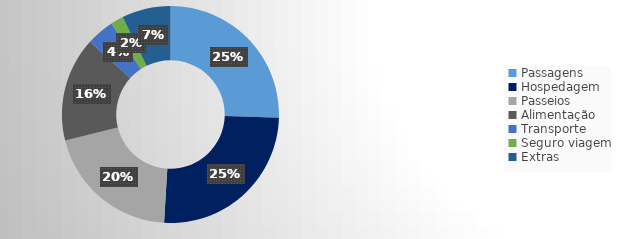
| Category | Series 0 |
|---|---|
| Passagens | 0.255 |
| Hospedagem | 0.255 |
| Passeios | 0.202 |
| Alimentação | 0.156 |
| Transporte | 0.042 |
| Seguro viagem | 0.019 |
| Extras | 0.073 |